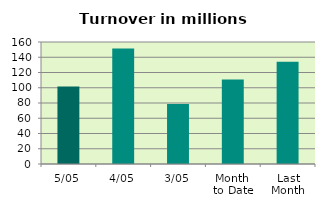
| Category | Series 0 |
|---|---|
| 5/05 | 101.777 |
| 4/05 | 151.373 |
| 3/05 | 78.825 |
| Month 
to Date | 110.658 |
| Last
Month | 133.981 |